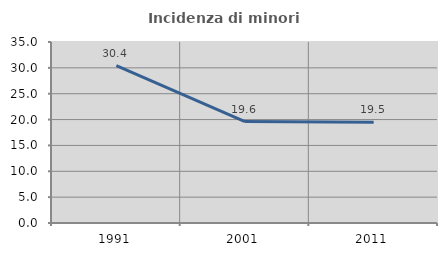
| Category | Incidenza di minori stranieri |
|---|---|
| 1991.0 | 30.435 |
| 2001.0 | 19.626 |
| 2011.0 | 19.494 |